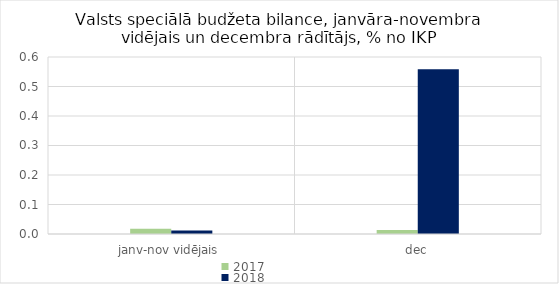
| Category | 2017 | 2018 |
|---|---|---|
| janv-nov vidējais | 0.018 | 0.012 |
| dec | 0.014 | 0.559 |